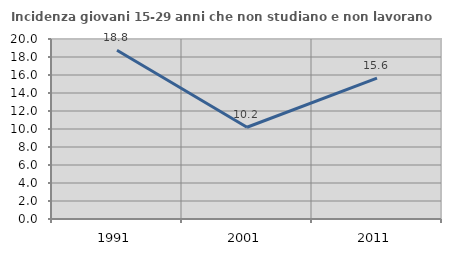
| Category | Incidenza giovani 15-29 anni che non studiano e non lavorano  |
|---|---|
| 1991.0 | 18.75 |
| 2001.0 | 10.195 |
| 2011.0 | 15.646 |